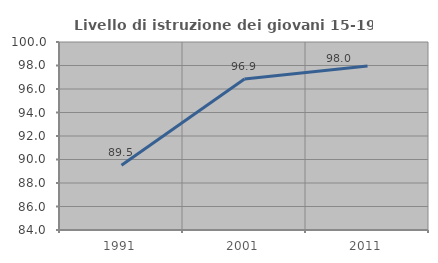
| Category | Livello di istruzione dei giovani 15-19 anni |
|---|---|
| 1991.0 | 89.519 |
| 2001.0 | 96.857 |
| 2011.0 | 97.959 |